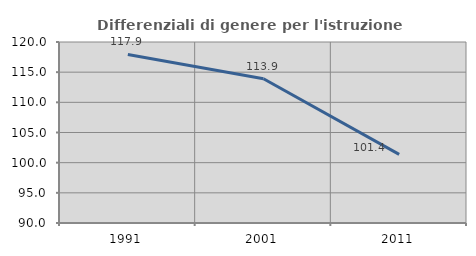
| Category | Differenziali di genere per l'istruzione superiore |
|---|---|
| 1991.0 | 117.942 |
| 2001.0 | 113.911 |
| 2011.0 | 101.376 |